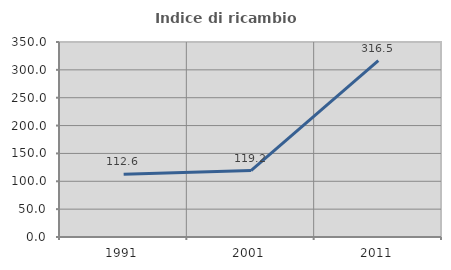
| Category | Indice di ricambio occupazionale  |
|---|---|
| 1991.0 | 112.621 |
| 2001.0 | 119.2 |
| 2011.0 | 316.484 |